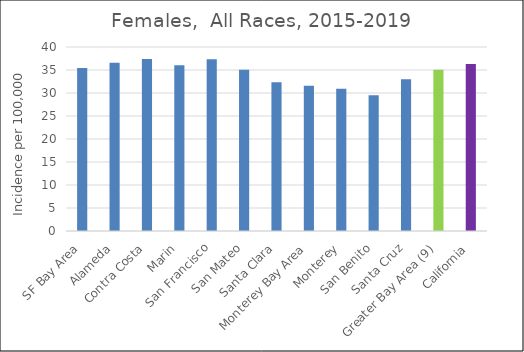
| Category | Female |
|---|---|
| SF Bay Area | 35.44 |
|   Alameda | 36.58 |
|   Contra Costa | 37.39 |
|   Marin | 36.04 |
|   San Francisco | 37.36 |
|   San Mateo | 35.07 |
|   Santa Clara | 32.33 |
| Monterey Bay Area | 31.58 |
|   Monterey | 30.93 |
|   San Benito | 29.5 |
|   Santa Cruz | 33.01 |
| Greater Bay Area (9) | 35.06 |
| California | 36.29 |